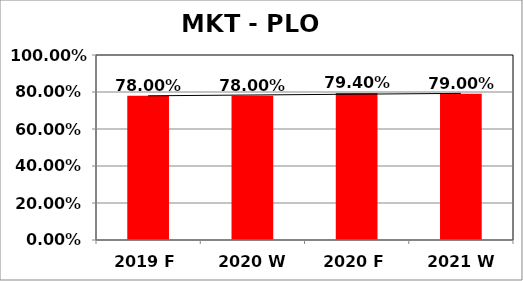
| Category | Series 0 |
|---|---|
| 2019 F | 0.78 |
| 2020 W | 0.78 |
| 2020 F | 0.794 |
| 2021 W | 0.79 |